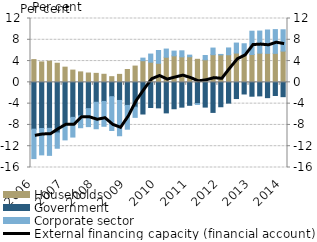
| Category | Households | Government | Corporate sector |
|---|---|---|---|
| 2006.0 | 4.275 | -8.796 | -5.53 |
| 2006.0 | 3.839 | -8.676 | -4.95 |
| 2006.0 | 3.973 | -8.644 | -5.076 |
| 2006.0 | 3.594 | -9.501 | -2.881 |
| 2007.0 | 2.857 | -8.002 | -2.81 |
| 2007.0 | 2.302 | -6.578 | -3.701 |
| 2007.0 | 1.967 | -6.305 | -2.219 |
| 2007.0 | 1.754 | -4.938 | -3.381 |
| 2008.0 | 1.689 | -3.742 | -4.975 |
| 2008.0 | 1.518 | -3.591 | -4.662 |
| 2008.0 | 1.068 | -2.692 | -6.358 |
| 2008.0 | 1.5 | -3.401 | -6.632 |
| 2009.0 | 2.42 | -4.329 | -4.472 |
| 2009.0 | 3.059 | -4.656 | -1.922 |
| 2009.0 | 4.074 | -5.948 | 0.48 |
| 2009.0 | 3.794 | -4.725 | 1.524 |
| 2010.0 | 3.581 | -4.792 | 2.403 |
| 2010.0 | 4.721 | -5.737 | 1.537 |
| 2010.0 | 4.983 | -4.96 | 0.891 |
| 2010.0 | 4.792 | -4.662 | 1.135 |
| 2011.0 | 4.816 | -4.313 | 0.3 |
| 2011.0 | 4.334 | -3.99 | -0.162 |
| 2011.0 | 4.244 | -4.65 | 0.799 |
| 2011.0 | 5.196 | -5.649 | 1.248 |
| 2012.0 | 5.163 | -4.584 | 0.087 |
| 2012.0 | 5.191 | -3.897 | 1.275 |
| 2012.0 | 5.507 | -3.044 | 1.876 |
| 2012.0 | 5.105 | -2.184 | 2.149 |
| 2013.0 | 5.233 | -2.604 | 4.379 |
| 2013.0 | 5.489 | -2.544 | 4.152 |
| 2013.0 | 5.454 | -2.874 | 4.387 |
| 2013.0 | 5.449 | -2.466 | 4.465 |
| 2014.0 | 5.875 | -2.69 | 4.006 |